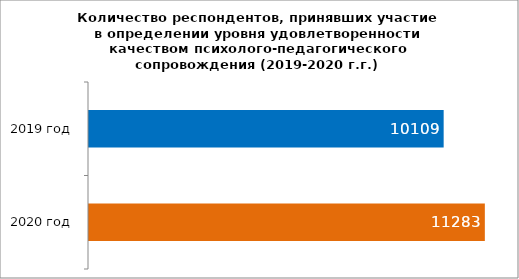
| Category | Series 0 |
|---|---|
| 2019 год | 10109 |
| 2020 год | 11283 |